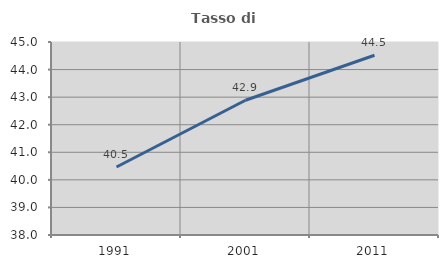
| Category | Tasso di occupazione   |
|---|---|
| 1991.0 | 40.467 |
| 2001.0 | 42.888 |
| 2011.0 | 44.521 |